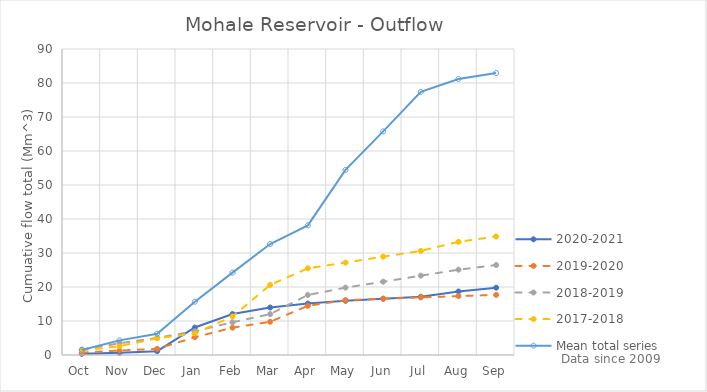
| Category | 2020-2021 | 2019-2020 | 2018-2019 | 2017-2018 | Mean total series |
|---|---|---|---|---|---|
| Oct | 0.333 | 0.69 | 1.61 | 1.37 | 1.482 |
| Nov | 0.681 | 1.32 | 3.43 | 2.59 | 4.305 |
| Dec | 1.136 | 1.82 | 5.03 | 4.91 | 6.253 |
| Jan | 8.08 | 5.225 | 6.99 | 6.33 | 15.676 |
| Feb | 12.041 | 8.031 | 9.62 | 11.33 | 24.217 |
| Mar | 13.967 | 9.768 | 12.03 | 20.61 | 32.65 |
| Apr | 15.114 | 14.469 | 17.65 | 25.5 | 38.127 |
| May | 15.954 | 16.135 | 19.82 | 27.18 | 54.438 |
| Jun | 16.546 | 16.54 | 21.55 | 28.92 | 65.772 |
| Jul | 17.122 | 16.947 | 23.33 | 30.61 | 77.387 |
| Aug | 18.678 | 17.316 | 25.09 | 33.29 | 81.197 |
| Sep | 19.791 | 17.68 | 26.46 | 34.85 | 82.913 |